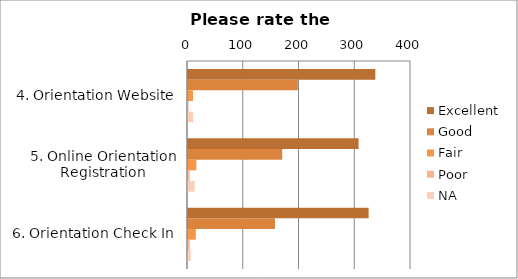
| Category | Excellent | Good | Fair | Poor | NA |
|---|---|---|---|---|---|
| 4. Orientation Website | 336 | 197 | 9 | 1 | 9 |
| 5. Online Orientation Registration | 306 | 169 | 15 | 3 | 12 |
| 6. Orientation Check In | 324 | 156 | 14 | 3 | 5 |